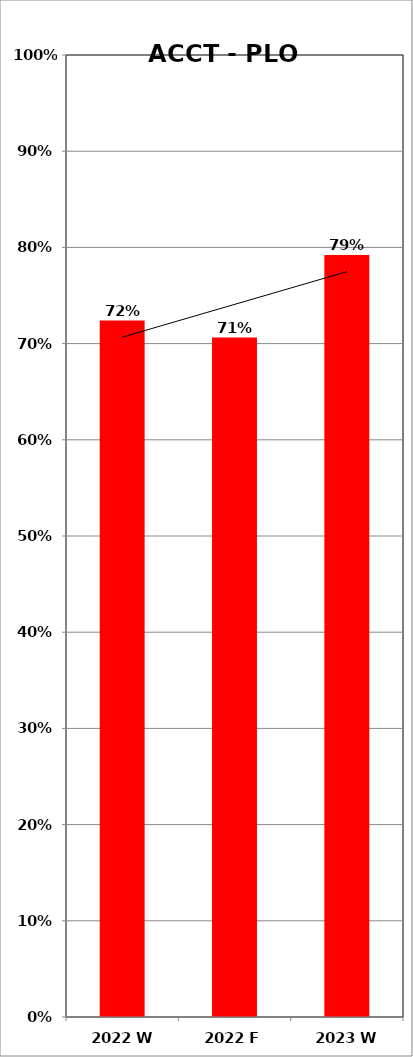
| Category | Series 0 |
|---|---|
| 2022 W | 0.724 |
| 2022 F | 0.706 |
| 2023 W | 0.792 |